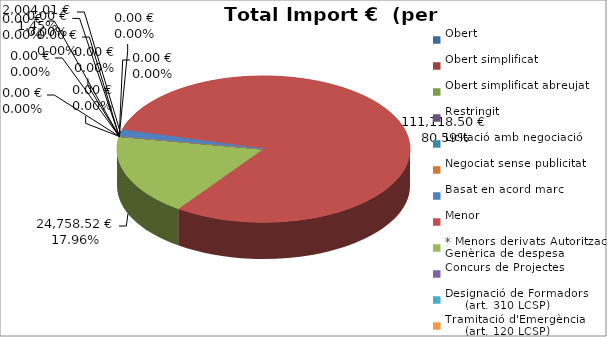
| Category | Total preu
(amb IVA) |
|---|---|
| Obert | 0 |
| Obert simplificat | 0 |
| Obert simplificat abreujat | 0 |
| Restringit | 0 |
| Licitació amb negociació | 0 |
| Negociat sense publicitat | 0 |
| Basat en acord marc | 2004.01 |
| Menor | 111118.5 |
| * Menors derivats Autorització Genèrica de despesa | 24758.52 |
| Concurs de Projectes | 0 |
| Designació de Formadors
     (art. 310 LCSP) | 0 |
| Tramitació d'Emergència
     (art. 120 LCSP) | 0 |